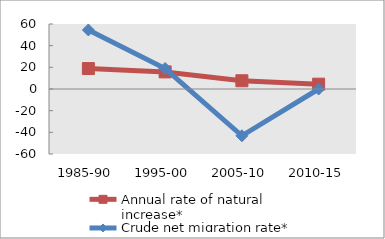
| Category | Annual rate of natural increase* | Crude net migration rate* |
|---|---|---|
| 1985-90 | 18.887 | 54.483 |
| 1995-00 | 15.784 | 18.883 |
| 2005-10 | 7.609 | -43.173 |
| 2010-15 | 4.443 | 0 |